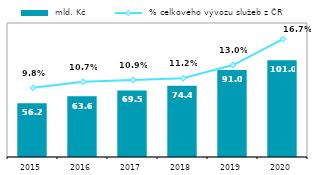
| Category |  mld. Kč |
|---|---|
| 2015.0 | 56.164 |
| 2016.0 | 63.584 |
| 2017.0 | 69.518 |
| 2018.0 | 74.364 |
| 2019.0 | 91 |
| 2020.0 | 101.013 |